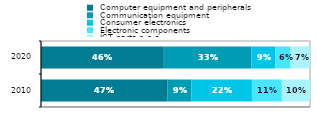
| Category |  Computer equipment and peripherals |  Communication equipment |  Consumer electronics |  Electronic components |  ICT parts n.e.s. |
|---|---|---|---|---|---|
|  2010 | 0.471 | 0.089 | 0.225 | 0.111 | 0.105 |
|  2020 | 0.457 | 0.325 | 0.089 | 0.057 | 0.072 |